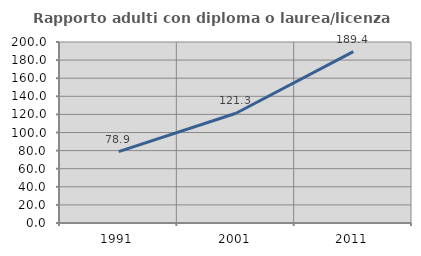
| Category | Rapporto adulti con diploma o laurea/licenza media  |
|---|---|
| 1991.0 | 78.947 |
| 2001.0 | 121.26 |
| 2011.0 | 189.394 |